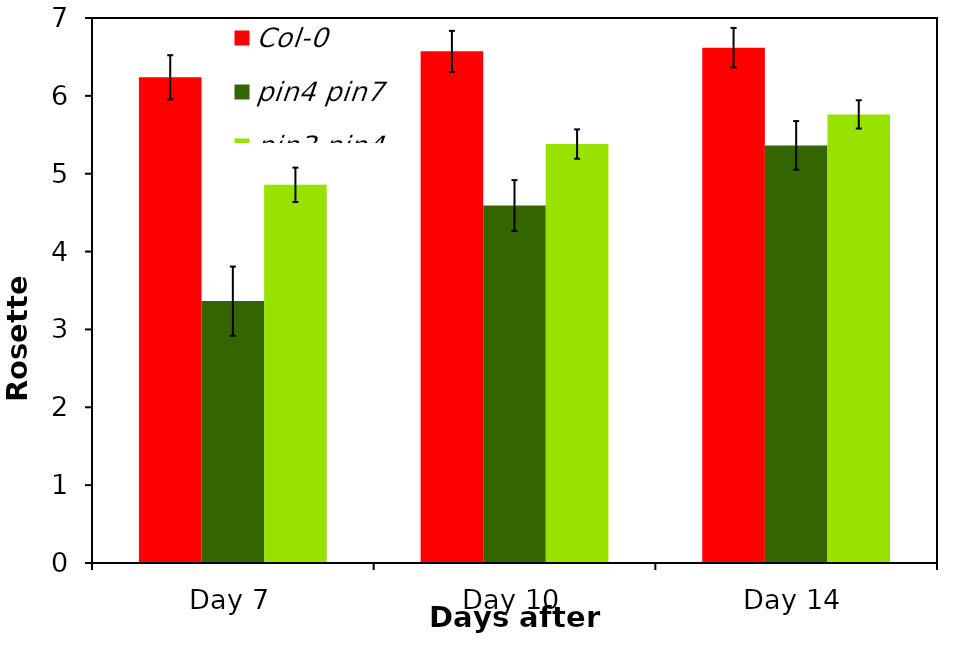
| Category | Col-0 | pin4 pin7 | pin3 pin4 pin7 |
|---|---|---|---|
| Day 7 | 6.238 | 3.364 | 4.857 |
| Day 10 | 6.571 | 4.591 | 5.381 |
| Day 14 | 6.619 | 5.364 | 5.762 |